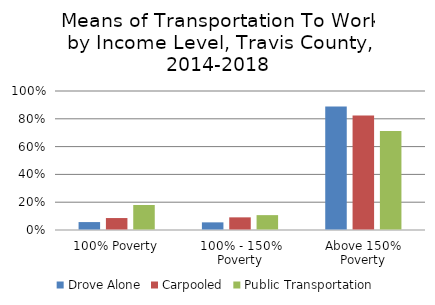
| Category | Drove Alone | Carpooled | Public Transportation |
|---|---|---|---|
| 100% Poverty | 0.057 | 0.086 | 0.18 |
| 100% - 150% Poverty | 0.055 | 0.091 | 0.107 |
| Above 150% Poverty | 0.888 | 0.823 | 0.713 |